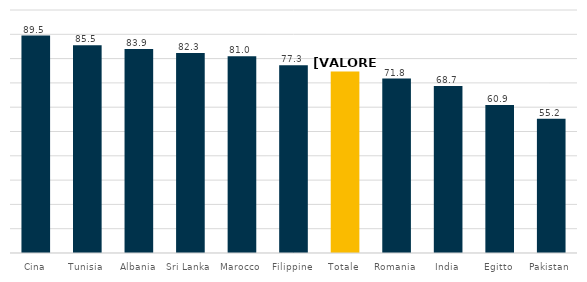
| Category | Series 0 |
|---|---|
| Cina | 89.5 |
| Tunisia | 85.5 |
| Albania | 83.9 |
| Sri Lanka | 82.3 |
| Marocco | 81 |
| Filippine | 77.3 |
| Totale | 74.69 |
| Romania | 71.8 |
| India | 68.7 |
| Egitto | 60.9 |
| Pakistan | 55.2 |